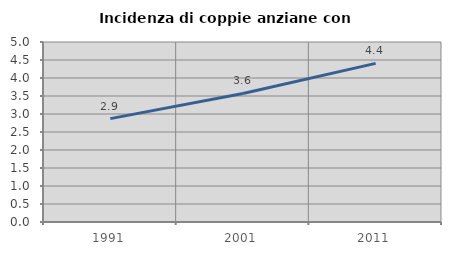
| Category | Incidenza di coppie anziane con figli |
|---|---|
| 1991.0 | 2.871 |
| 2001.0 | 3.571 |
| 2011.0 | 4.405 |